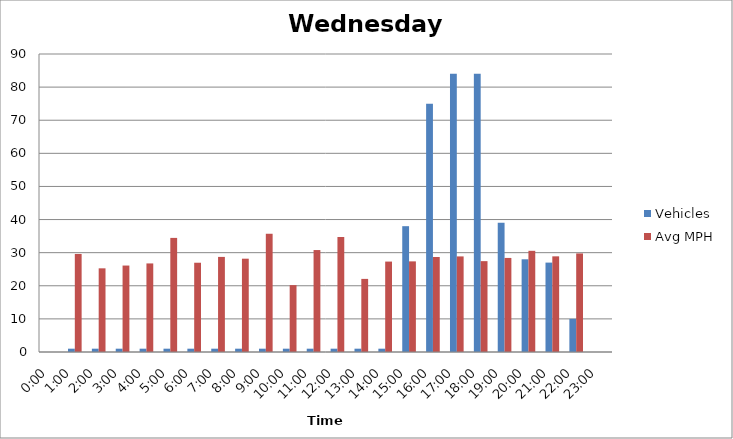
| Category | Vehicles | Avg MPH |
|---|---|---|
| 0:00 | 0 | 0 |
| 1:00 | 1 | 29.61 |
| 2:00 | 1 | 25.27 |
| 3:00 | 1 | 26.11 |
| 4:00 | 1 | 26.75 |
| 5:00 | 1 | 34.46 |
| 6:00 | 1 | 26.96 |
| 7:00 | 1 | 28.72 |
| 8:00 | 1 | 28.18 |
| 9:00 | 1 | 35.71 |
| 10:00 | 1 | 20.2 |
| 11:00 | 1 | 30.79 |
| 12:00 | 1 | 34.74 |
| 13:00 | 1 | 22.08 |
| 14:00 | 1 | 27.31 |
| 15:00 | 38 | 27.37 |
| 16:00 | 75 | 28.7 |
| 17:00 | 84 | 28.87 |
| 18:00 | 84 | 27.44 |
| 19:00 | 39 | 28.41 |
| 20:00 | 28 | 30.56 |
| 21:00 | 27 | 28.89 |
| 22:00 | 10 | 29.77 |
| 23:00 | 0 | 0 |